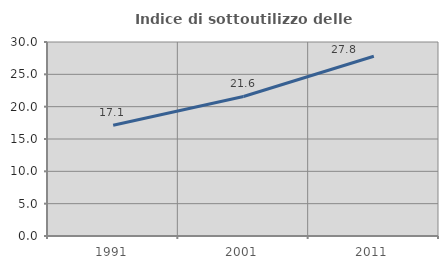
| Category | Indice di sottoutilizzo delle abitazioni  |
|---|---|
| 1991.0 | 17.119 |
| 2001.0 | 21.576 |
| 2011.0 | 27.803 |